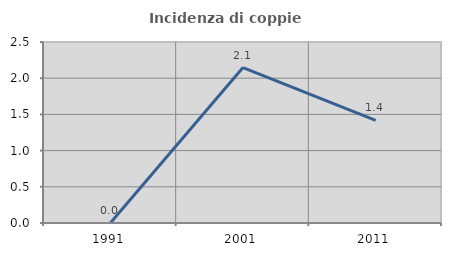
| Category | Incidenza di coppie miste |
|---|---|
| 1991.0 | 0 |
| 2001.0 | 2.147 |
| 2011.0 | 1.418 |